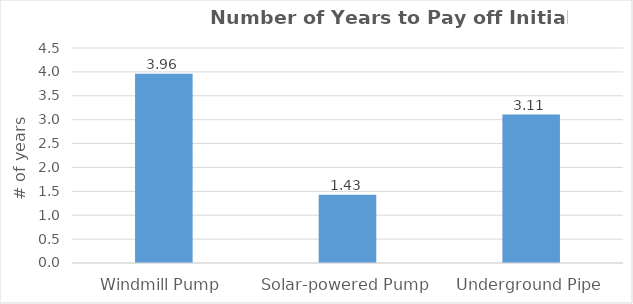
| Category | Series 0 |
|---|---|
| Windmill Pump | 3.961 |
| Solar-powered Pump | 1.43 |
| Underground Pipe | 3.106 |